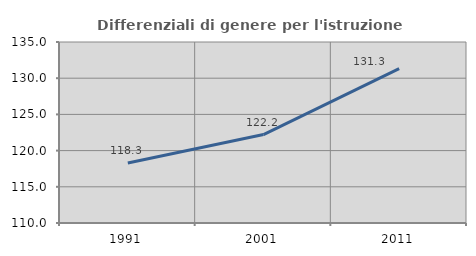
| Category | Differenziali di genere per l'istruzione superiore |
|---|---|
| 1991.0 | 118.28 |
| 2001.0 | 122.214 |
| 2011.0 | 131.323 |